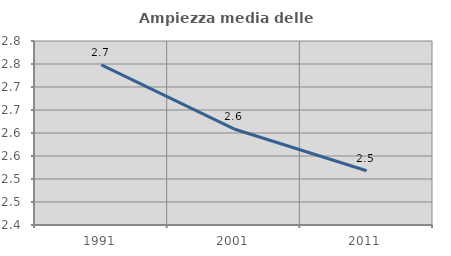
| Category | Ampiezza media delle famiglie |
|---|---|
| 1991.0 | 2.748 |
| 2001.0 | 2.609 |
| 2011.0 | 2.518 |